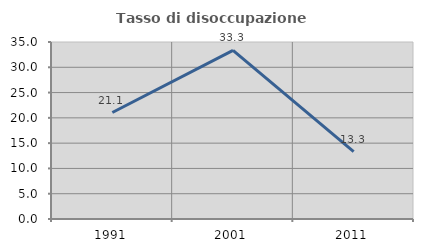
| Category | Tasso di disoccupazione giovanile  |
|---|---|
| 1991.0 | 21.053 |
| 2001.0 | 33.333 |
| 2011.0 | 13.333 |